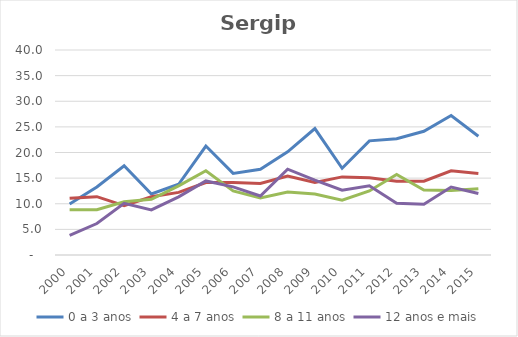
| Category | 0 a 3 anos | 4 a 7 anos | 8 a 11 anos | 12 anos e mais |
|---|---|---|---|---|
| 2000.0 | 9.953 | 11.074 | 8.809 | 3.83 |
| 2001.0 | 13.278 | 11.385 | 8.84 | 6.135 |
| 2002.0 | 17.418 | 9.605 | 10.401 | 10.07 |
| 2003.0 | 11.91 | 11.374 | 10.867 | 8.796 |
| 2004.0 | 13.804 | 12.223 | 13.486 | 11.336 |
| 2005.0 | 21.267 | 14.147 | 16.429 | 14.449 |
| 2006.0 | 15.928 | 14.166 | 12.496 | 13.3 |
| 2007.0 | 16.722 | 13.946 | 11.125 | 11.521 |
| 2008.0 | 20.13 | 15.397 | 12.274 | 16.746 |
| 2009.0 | 24.669 | 14.15 | 11.882 | 14.6 |
| 2010.0 | 16.927 | 15.242 | 10.706 | 12.632 |
| 2011.0 | 22.269 | 15.086 | 12.492 | 13.521 |
| 2012.0 | 22.696 | 14.406 | 15.716 | 10.096 |
| 2013.0 | 24.146 | 14.399 | 12.662 | 9.882 |
| 2014.0 | 27.213 | 16.429 | 12.576 | 13.264 |
| 2015.0 | 23.179 | 15.89 | 12.941 | 11.994 |